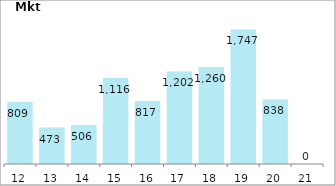
| Category | Series 0 |
|---|---|
| 2012-03-31 | 808.606 |
| 2013-03-31 | 473.454 |
| 2014-03-31 | 505.969 |
| 2015-03-31 | 1116.186 |
| 2016-03-31 | 816.954 |
| 2017-03-31 | 1201.979 |
| 2018-03-31 | 1259.65 |
| 2019-03-31 | 1747.164 |
| 2020-03-31 | 837.826 |
| 2021-03-31 | 0 |